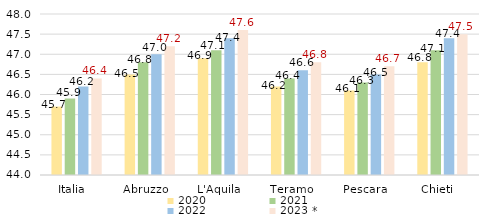
| Category | 2020   | 2021   | 2022   | 2023 *   |
|---|---|---|---|---|
| Italia   | 45.7 | 45.9 | 46.2 | 46.4 |
| Abruzzo   | 46.5 | 46.8 | 47 | 47.2 |
| L'Aquila   | 46.9 | 47.1 | 47.4 | 47.6 |
| Teramo   | 46.2 | 46.4 | 46.6 | 46.8 |
| Pescara   | 46.1 | 46.3 | 46.5 | 46.7 |
| Chieti   | 46.8 | 47.1 | 47.4 | 47.5 |